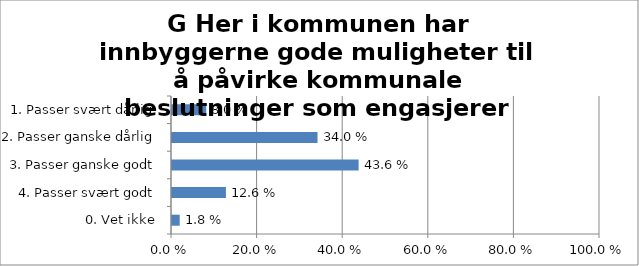
| Category | G Her i kommunen har innbyggerne gode muligheter til å påvirke kommunale beslutninger som engasjerer dem. |
|---|---|
| 1. Passer svært dårlig | 0.08 |
| 2. Passer ganske dårlig | 0.34 |
| 3. Passer ganske godt | 0.436 |
| 4. Passer svært godt | 0.126 |
| 0. Vet ikke | 0.018 |